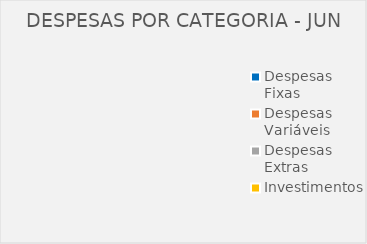
| Category | Series 0 |
|---|---|
| Despesas Fixas | 0 |
| Despesas Variáveis | 0 |
| Despesas Extras | 0 |
| Investimentos | 0 |